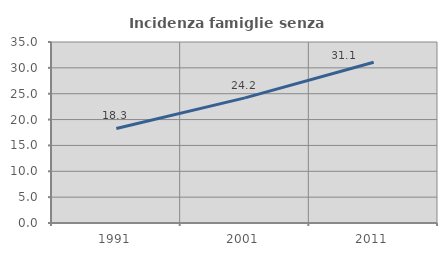
| Category | Incidenza famiglie senza nuclei |
|---|---|
| 1991.0 | 18.28 |
| 2001.0 | 24.197 |
| 2011.0 | 31.074 |